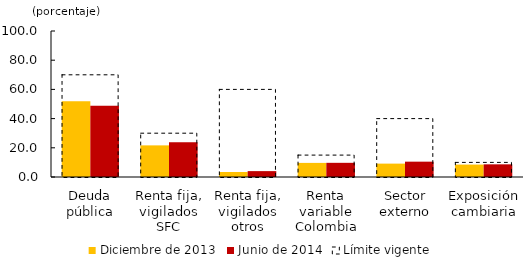
| Category | Diciembre de 2013 | Junio de 2014 |
|---|---|---|
| Deuda pública | 51.882 | 48.885 |
| Renta fija, vigilados SFC | 21.659 | 23.842 |
| Renta fija, vigilados otros | 3.431 | 4.026 |
| Renta variable Colombia | 9.66 | 9.71 |
| Sector externo | 9.163 | 10.503 |
| Exposición cambiaria | 8.5 | 8.673 |